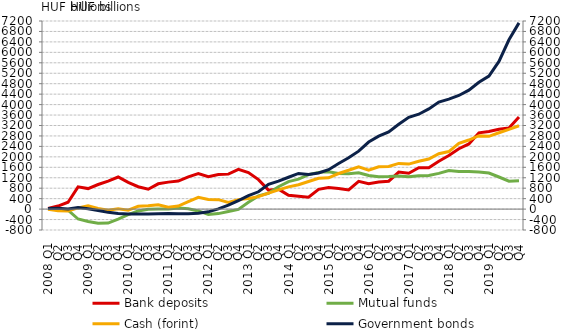
| Category | Bank deposits | Mutual funds | Cash (forint) |
|---|---|---|---|
| 2008 Q1 | 25.327 | 26.165 | -6.424 |
| Q2 | 117.161 | -14.599 | -61.286 |
| Q3 | 261.842 | -38.376 | -74.693 |
| Q4 | 851.283 | -379.05 | 44.628 |
| 2009 Q1 | 784.766 | -476.11 | 128.732 |
| Q2 | 942.105 | -540.979 | 28.435 |
| Q3 | 1073.853 | -536.509 | -42.533 |
| Q4 | 1228.285 | -380.531 | 12.963 |
| 2010 Q1 | 1020.36 | -213.951 | -42.533 |
| Q2 | 856.15 | -69.989 | 107.797 |
| Q3 | 760.729 | -3.064 | 125.081 |
| Q4 | 968.021 | 5.307 | 165.724 |
| 2011 Q1 | 1032.297 | 6.968 | 70.174 |
| Q2 | 1072.14 | 38.963 | 117.81 |
| Q3 | 1236.915 | 16.305 | 281.572 |
| Q4 | 1361.632 | -70.24 | 451.801 |
| 2012 Q1 | 1236.398 | -202.446 | 367.298 |
| Q2 | 1323.103 | -172.071 | 362.264 |
| Q3 | 1338.744 | -89.3 | 252.914 |
| Q4 | 1520.475 | -10.203 | 362.672 |
| 2013 Q1 | 1397.917 | 263.554 | 408.44 |
| Q2 | 1128.168 | 506.175 | 476.662 |
| Q3 | 725.162 | 605.191 | 610.469 |
| Q4 | 763.737 | 855.499 | 737.929 |
| 2014 Q1 | 532.142 | 1052.584 | 849.747 |
| Q2 | 492.766 | 1146.502 | 932.349 |
| Q3 | 454.417 | 1319.592 | 1056.41 |
| Q4 | 754.158 | 1405.957 | 1178.564 |
| 2015 Q1 | 824.186 | 1429.501 | 1197.17 |
| Q2 | 791.412 | 1367.25 | 1361.736 |
| Q3 | 734.852 | 1354.616 | 1485.874 |
| Q4 | 1063.284 | 1387.636 | 1622.451 |
| 2016 Q1 | 967.906 | 1286.835 | 1493.331 |
| Q2 | 1033.243 | 1238.377 | 1621.612 |
| Q3 | 1068.691 | 1248.315 | 1632.614 |
| Q4 | 1415.314 | 1267.374 | 1748.734 |
| 2017 Q1 | 1372.884 | 1241.208 | 1722.462 |
| Q2 | 1583.333 | 1278.332 | 1832.926 |
| Q3 | 1585.634 | 1284.224 | 1914.259 |
| Q4 | 1832.73 | 1367.164 | 2121.674 |
| 2018 Q1 | 2048.349 | 1475.272 | 2203.085 |
| Q2 | 2309.783 | 1443.063 | 2516.604 |
| Q3 | 2493.194 | 1435.168 | 2643.625 |
| Q4 | 2919.201 | 1423.665 | 2809.165 |
| 2019 Q1 | 2970.721 | 1382.389 | 2785.16 |
| Q2 | 3059.403 | 1229.063 | 2922.464 |
| Q3 | 3105.99 | 1069.987 | 3050.715 |
| Q4 | 3524.826 | 1088.141 | 3191.447 |